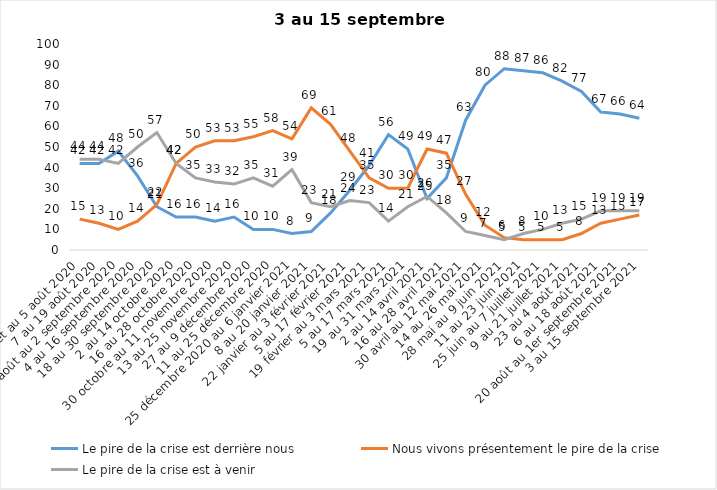
| Category | Le pire de la crise est derrière nous | Nous vivons présentement le pire de la crise | Le pire de la crise est à venir |
|---|---|---|---|
| 24 juillet au 5 août 2020 | 42 | 15 | 44 |
| 7 au 19 août 2020 | 42 | 13 | 44 |
| 21 août au 2 septembre 2020 | 48 | 10 | 42 |
| 4 au 16 septembre 2020 | 36 | 14 | 50 |
| 18 au 30 septembre 2020 | 21 | 22 | 57 |
| 2 au 14 octobre 2020 | 16 | 42 | 42 |
| 16 au 28 octobre 2020 | 16 | 50 | 35 |
| 30 octobre au 11 novembre 2020 | 14 | 53 | 33 |
| 13 au 25 novembre 2020 | 16 | 53 | 32 |
| 27 au 9 décembre 2020 | 10 | 55 | 35 |
| 11 au 25 décembre 2020 | 10 | 58 | 31 |
| 25 décembre 2020 au 6 janvier 2021 | 8 | 54 | 39 |
| 8 au 20 janvier 2021 | 9 | 69 | 23 |
| 22 janvier au 3 février 2021 | 18 | 61 | 21 |
| 5 au 17 février 2021 | 29 | 48 | 24 |
| 19 février au 3 mars 2021 | 41 | 35 | 23 |
| 5 au 17 mars 2021 | 56 | 30 | 14 |
| 19 au 31 mars 2021 | 49 | 30 | 21 |
| 2 au 14 avril 2021 | 25 | 49 | 26 |
| 16 au 28 avril 2021 | 35 | 47 | 18 |
| 30 avril au 12 mai 2021 | 63 | 27 | 9 |
| 14 au 26 mai 2021 | 80 | 12 | 7 |
| 28 mai au 9 juin 2021 | 88 | 6 | 5 |
| 11 au 23 juin 2021 | 87 | 5 | 8 |
| 25 juin au 7 juillet 2021 | 86 | 5 | 10 |
| 9 au 21 juillet 2021 | 82 | 5 | 13 |
| 23 au 4 août 2021 | 77 | 8 | 15 |
| 6 au 18 août 2021 | 67 | 13 | 19 |
| 20 août au 1er septembre 2021 | 66 | 15 | 19 |
| 3 au 15 septembre 2021 | 64 | 17 | 19 |